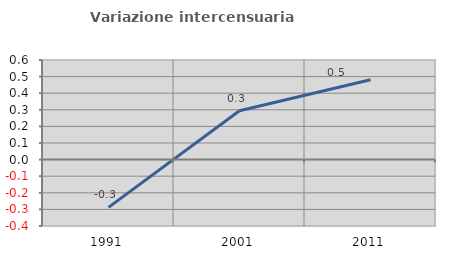
| Category | Variazione intercensuaria annua |
|---|---|
| 1991.0 | -0.288 |
| 2001.0 | 0.294 |
| 2011.0 | 0.481 |